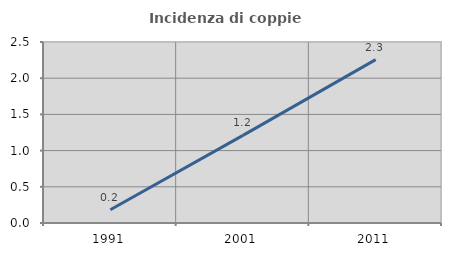
| Category | Incidenza di coppie miste |
|---|---|
| 1991.0 | 0.183 |
| 2001.0 | 1.21 |
| 2011.0 | 2.256 |